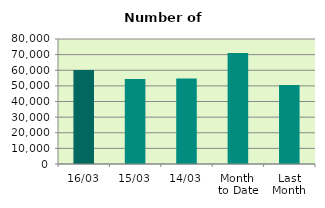
| Category | Series 0 |
|---|---|
| 16/03 | 60194 |
| 15/03 | 54386 |
| 14/03 | 54792 |
| Month 
to Date | 71056.5 |
| Last
Month | 50484.7 |